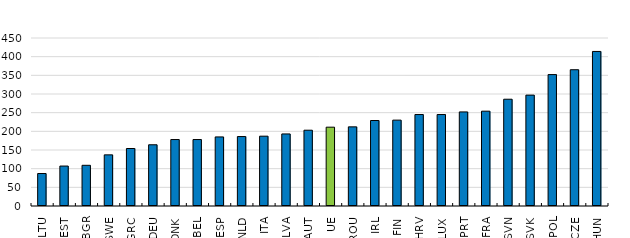
| Category | Nombre de professions réglementées |
|---|---|
| LTU | 87 |
| EST | 107 |
| BGR | 109 |
| SWE | 137 |
| GRC | 154 |
| DEU | 164 |
| DNK | 178 |
| BEL | 178 |
| ESP | 185 |
| NLD | 186 |
| ITA | 187 |
| LVA | 193 |
| AUT | 203 |
| UE | 211.111 |
| ROU | 212 |
| IRL | 229 |
| FIN | 230 |
| HRV | 245 |
| LUX | 245 |
| PRT | 252 |
| FRA | 254 |
| SVN | 286 |
| SVK | 297 |
| POL | 352 |
| CZE | 365 |
| HUN | 414 |